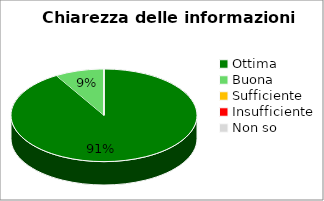
| Category | Series 0 |
|---|---|
| Ottima | 32 |
| Buona | 3 |
| Sufficiente | 0 |
| Insufficiente | 0 |
| Non so | 0 |